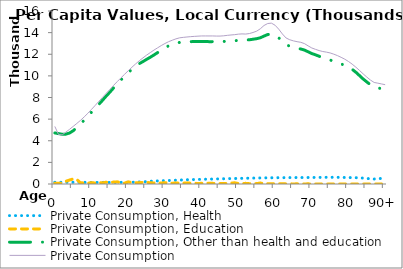
| Category | Private Consumption, Health | Private Consumption, Education | Private Consumption, Other than health and education | Private Consumption |
|---|---|---|---|---|
| 0 | 161.713 | 72.797 | 4721.62 | 5323.666 |
|  | 162.622 | 64.672 | 4661.27 | 4579.311 |
| 2 | 163.53 | 82.457 | 4600.921 | 4543.027 |
| 3 | 164.094 | 249.417 | 4611.681 | 4798.084 |
| 4 | 163.838 | 366.413 | 4713.187 | 5053.141 |
| 5 | 163.009 | 470.785 | 4925.821 | 5326.358 |
| 6 | 161.154 | 407.352 | 5212.205 | 5603.438 |
| 7 | 156.62 | 109.334 | 5551.851 | 5886.211 |
| 8 | 154.394 | 104.592 | 5904.812 | 6205.995 |
| 9 | 152.127 | 71.757 | 6261.532 | 6541.111 |
| 10 | 150.303 | 127.633 | 6642.922 | 6904.881 |
| 11 | 149.389 | 89.186 | 7005.624 | 7269.277 |
| 12 | 152.617 | 133.5 | 7368.27 | 7648.548 |
| 13 | 151.081 | 106.791 | 7741.566 | 8016.367 |
| 14 | 149.08 | 167.365 | 8129.425 | 8391.736 |
| 15 | 148.403 | 135.013 | 8495.669 | 8749.74 |
| 16 | 150.079 | 179.303 | 8883.72 | 9117.651 |
| 17 | 149.448 | 200.58 | 9262.321 | 9469.167 |
| 18 | 153.838 | 119.732 | 9619.65 | 9809.554 |
| 19 | 160.264 | 77.132 | 9967.966 | 10145.928 |
| 20 | 162.618 | 199.158 | 10298.549 | 10476.325 |
| 21 | 162.188 | 128.774 | 10605.974 | 10798.892 |
| 22 | 172.005 | 124.601 | 10885.401 | 11103.843 |
| 23 | 187.3 | 120.963 | 11127.049 | 11398.56 |
| 24 | 201.638 | 155.034 | 11323.91 | 11660.545 |
| 25 | 225.571 | 156.471 | 11527.479 | 11917.927 |
| 26 | 253.297 | 104.077 | 11722.704 | 12150.302 |
| 27 | 272.567 | 103.54 | 11931.879 | 12382.445 |
| 28 | 285.795 | 70.215 | 12152.411 | 12593.997 |
| 29 | 300.903 | 90.664 | 12386.786 | 12804.678 |
| 30 | 312.048 | 122.609 | 12596.717 | 12993.602 |
| 31 | 322.876 | 113.571 | 12773.931 | 13161.965 |
| 32 | 336.492 | 70.643 | 12906.994 | 13298.887 |
| 33 | 351.88 | 97.033 | 13015.757 | 13424.31 |
| 34 | 366.272 | 83.296 | 13095.589 | 13519.628 |
| 35 | 380.448 | 84.255 | 13123.596 | 13561.743 |
| 36 | 392.902 | 84.992 | 13144.967 | 13596.122 |
| 37 | 404.044 | 84.631 | 13163.289 | 13628.192 |
| 38 | 413.757 | 68.036 | 13176.378 | 13653.172 |
| 39 | 423.156 | 48.497 | 13180.445 | 13674.616 |
| 40 | 432.087 | 63.166 | 13178.838 | 13692.424 |
| 41 | 440.292 | 69.594 | 13171.654 | 13692.564 |
| 42 | 448.627 | 71.425 | 13166.57 | 13692.127 |
| 43 | 458.037 | 57.859 | 13164.915 | 13693.388 |
| 44 | 466.427 | 56.105 | 13160.872 | 13681.853 |
| 45 | 475.366 | 35.28 | 13165.779 | 13681.778 |
| 46 | 485.241 | 39.928 | 13184.1 | 13705.731 |
| 47 | 493.807 | 48.698 | 13218.103 | 13747.908 |
| 48 | 501.096 | 89.302 | 13236.74 | 13782.025 |
| 49 | 508.599 | 110.188 | 13248.341 | 13811.95 |
| 50 | 516.707 | 46.064 | 13282.862 | 13859.134 |
| 51 | 524.026 | 46.12 | 13322.212 | 13882.752 |
| 52 | 531.823 | 59.823 | 13323.334 | 13867.055 |
| 53 | 540.851 | 31.353 | 13336.358 | 13914.372 |
| 54 | 548.776 | 41.945 | 13389.774 | 14012.498 |
| 55 | 553.808 | 33.866 | 13441.865 | 14137.716 |
| 56 | 559.709 | 90.41 | 13526.972 | 14359.583 |
| 57 | 565.865 | 24.545 | 13681.526 | 14661.822 |
| 58 | 569.554 | 31.249 | 13824.961 | 14842.112 |
| 59 | 574.189 | 33.656 | 13865.392 | 14875.874 |
| 60 | 579.833 | 12.226 | 13756.626 | 14684.996 |
| 61 | 584.031 | 26.472 | 13515.426 | 14319.374 |
| 62 | 586.909 | 13.425 | 13208.847 | 13874.834 |
| 63 | 589.775 | 15.017 | 12910.218 | 13505.373 |
| 64 | 591.447 | 15.899 | 12738.947 | 13340.716 |
| 65 | 593.029 | 8.612 | 12632.478 | 13237.493 |
| 66 | 594.971 | 14.397 | 12545.376 | 13163.229 |
| 67 | 597.171 | 9.541 | 12487.229 | 13104.256 |
| 68 | 599.313 | 7.188 | 12388.98 | 12986.678 |
| 69 | 600.671 | 15.034 | 12229.068 | 12777.887 |
| 70 | 603.015 | 0 | 12065.527 | 12583.299 |
| 71 | 605.459 | 0 | 11947.764 | 12456.413 |
| 72 | 607.814 | 0 | 11817.945 | 12340.525 |
| 73 | 612.759 | 0 | 11694.267 | 12254.003 |
| 74 | 617.48 | 0 | 11588.253 | 12196.486 |
| 75 | 619.55 | 0 | 11470.302 | 12122.205 |
| 76 | 619.038 | 0 | 11335.013 | 12007.914 |
| 77 | 615.907 | 0 | 11210.328 | 11875.597 |
| 78 | 609.016 | 0 | 11095.646 | 11716.453 |
| 79 | 601.895 | 0 | 10986.834 | 11542.788 |
| 80 | 595.525 | 0 | 10816.976 | 11331.233 |
| 81 | 588.806 | 0 | 10609.963 | 11086.976 |
| 82 | 581.128 | 0 | 10340.869 | 10809.789 |
| 83 | 569.082 | 0 | 10029.463 | 10504.899 |
| 84 | 546.044 | 0 | 9711.843 | 10187.331 |
| 85 | 511.43 | 0 | 9439.936 | 9889.596 |
| 86 | 477.857 | 0 | 9174.041 | 9611.06 |
| 87 | 458.317 | 0 | 8965.302 | 9391.664 |
| 88 | 485.613 | 0 | 8896.61 | 9326.512 |
| 89 | 517.577 | 0 | 8807.492 | 9255.218 |
| 90+ | 549.541 | 0 | 8718.375 | 9183.924 |